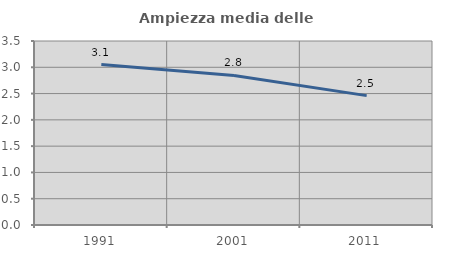
| Category | Ampiezza media delle famiglie |
|---|---|
| 1991.0 | 3.052 |
| 2001.0 | 2.845 |
| 2011.0 | 2.461 |